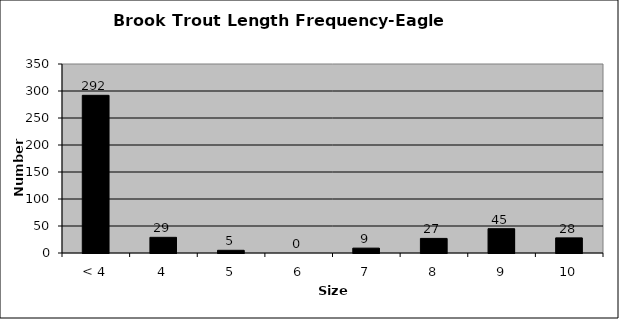
| Category | Series 0 |
|---|---|
| < 4 | 292 |
| 4 | 29 |
| 5 | 5 |
| 6 | 0 |
| 7 | 9 |
| 8 | 27 |
| 9 | 45 |
| 10 | 28 |